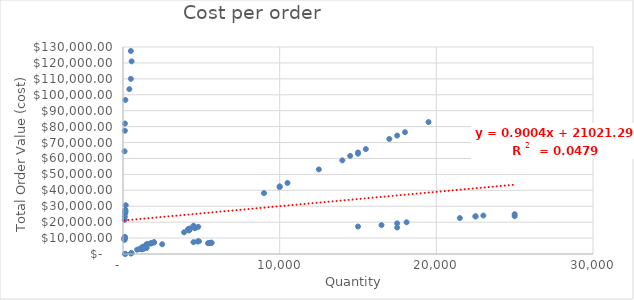
| Category | Cost per order |
|---|---|
| 4500.0 | 17775 |
| 500.0 | 127500 |
| 10000.0 | 42500 |
| 406.0 | 103530 |
| 9000.0 | 38250 |
| 150.0 | 27750 |
| 140.0 | 25900 |
| 10500.0 | 44625 |
| 1250.0 | 4562.5 |
| 1450.0 | 5292.5 |
| 550.0 | 121000 |
| 1470.0 | 5365.5 |
| 1985.0 | 7245.25 |
| 500.0 | 110000 |
| 3900.0 | 13650 |
| 15000.0 | 63000 |
| 100.0 | 9000 |
| 120.0 | 10800 |
| 14000.0 | 58800 |
| 25000.0 | 25000 |
| 10000.0 | 42000 |
| 1300.0 | 3185 |
| 1200.0 | 2940 |
| 2500.0 | 6125 |
| 1250.0 | 3062.5 |
| 1500.0 | 3675 |
| 150.0 | 26250 |
| 110.0 | 10450 |
| 105.0 | 9975 |
| 22500.0 | 23625 |
| 175.0 | 30625 |
| 21500.0 | 22575 |
| 23000.0 | 24150 |
| 5650.0 | 7062.5 |
| 155.0 | 27125 |
| 22500.0 | 23625 |
| 19500.0 | 82875 |
| 5600.0 | 7000 |
| 15500.0 | 65875 |
| 5500.0 | 6875 |
| 18000.0 | 76500 |
| 12500.0 | 53125 |
| 15000.0 | 63750 |
| 14500.0 | 61625 |
| 25000.0 | 23750 |
| 5650.0 | 7062.5 |
| 5425.0 | 6781.25 |
| 500.0 | 375 |
| 17500.0 | 16625 |
| 17500.0 | 74375 |
| 17000.0 | 72250 |
| 1250.0 | 3562.5 |
| 95.0 | 9547.5 |
| 525.0 | 525 |
| 1350.0 | 3847.5 |
| 1300.0 | 3705 |
| 100.0 | 10050 |
| 550.0 | 467.5 |
| 150.0 | 82.5 |
| 125.0 | 68.75 |
| 90.0 | 9045 |
| 125.0 | 81937.5 |
| 1500.0 | 4425 |
| 1980.0 | 7425 |
| 1850.0 | 6937.5 |
| 1800.0 | 6750 |
| 1750.0 | 6562.5 |
| 900.0 | 2700 |
| 1500.0 | 6075 |
| 1100.0 | 3300 |
| 1550.0 | 6277.5 |
| 15000.0 | 17250 |
| 1050.0 | 3150 |
| 4200.0 | 14910 |
| 4250.0 | 15087.5 |
| 4200.0 | 14910 |
| 4600.0 | 16330 |
| 4800.0 | 17040 |
| 4585.0 | 16276.75 |
| 17500.0 | 19250 |
| 4250.0 | 15937.5 |
| 16500.0 | 18150 |
| 120.0 | 23400 |
| 4200.0 | 15750 |
| 4150.0 | 15562.5 |
| 110.0 | 21450 |
| 4500.0 | 7425 |
| 4750.0 | 7837.5 |
| 4850.0 | 8002.5 |
| 150.0 | 96750 |
| 100.0 | 64500 |
| 130.0 | 25350 |
| 120.0 | 77400 |
| 18100.0 | 19910 |